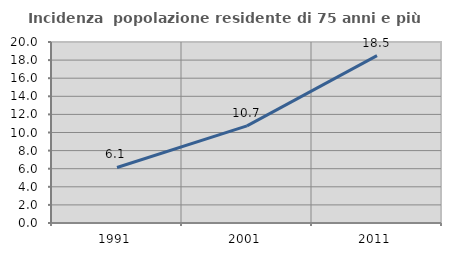
| Category | Incidenza  popolazione residente di 75 anni e più |
|---|---|
| 1991.0 | 6.137 |
| 2001.0 | 10.728 |
| 2011.0 | 18.487 |